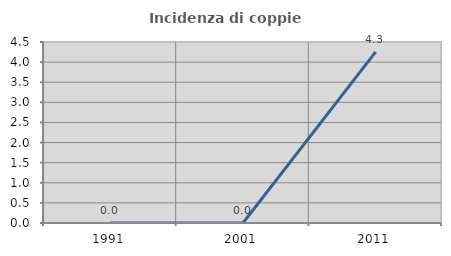
| Category | Incidenza di coppie miste |
|---|---|
| 1991.0 | 0 |
| 2001.0 | 0 |
| 2011.0 | 4.255 |